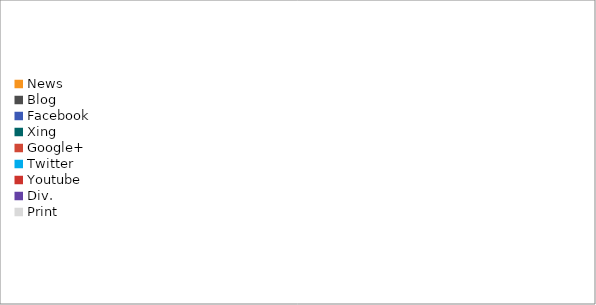
| Category | Series 0 |
|---|---|
| News | 0 |
| Blog | 0 |
| Facebook | 0 |
| Xing | 0 |
| Google+ | 0 |
| Twitter | 0 |
| Youtube | 0 |
| Div. | 0 |
| Print | 0 |